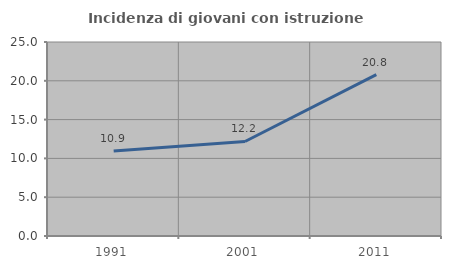
| Category | Incidenza di giovani con istruzione universitaria |
|---|---|
| 1991.0 | 10.942 |
| 2001.0 | 12.182 |
| 2011.0 | 20.798 |